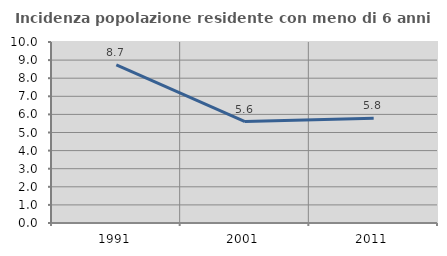
| Category | Incidenza popolazione residente con meno di 6 anni |
|---|---|
| 1991.0 | 8.734 |
| 2001.0 | 5.605 |
| 2011.0 | 5.784 |